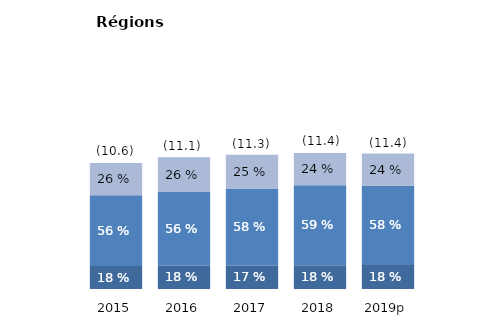
| Category | Personnel | Autre fonctionnement | Investissement |
|---|---|---|---|
| 2015 | 1.926 | 5.95 | 2.717 |
| 2016 | 1.956 | 6.19 | 2.916 |
| 2017 | 1.958 | 6.494 | 2.825 |
| 2018 | 1.999 | 6.722 | 2.699 |
| 2019p | 2.014 | 6.657 | 2.711 |